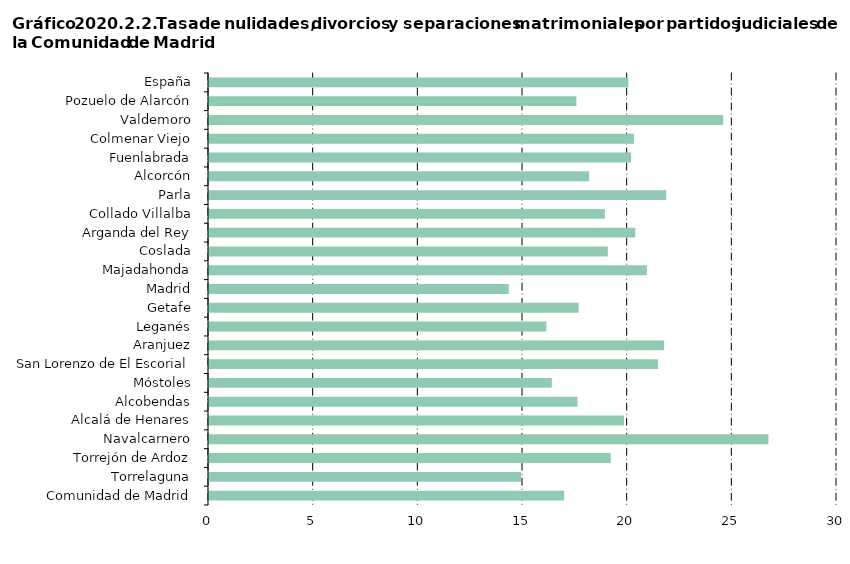
| Category | Series 0 |
|---|---|
| Comunidad de Madrid | 16.969 |
|     Torrelaguna | 14.91 |
|     Torrejón de Ardoz | 19.194 |
|     Navalcarnero | 26.724 |
|     Alcalá de Henares | 19.825 |
|     Alcobendas | 17.601 |
|     Móstoles | 16.375 |
|     San Lorenzo de El Escorial | 21.454 |
|     Aranjuez | 21.742 |
|     Leganés | 16.116 |
|     Getafe | 17.658 |
|     Madrid | 14.322 |
|     Majadahonda | 20.919 |
|     Coslada | 19.047 |
|     Arganda del Rey | 20.363 |
|     Collado Villalba | 18.911 |
|     Parla | 21.841 |
|     Alcorcón | 18.157 |
|     Fuenlabrada | 20.167 |
|     Colmenar Viejo | 20.298 |
|     Valdemoro | 24.56 |
|     Pozuelo de Alarcón | 17.553 |
| España | 20.033 |